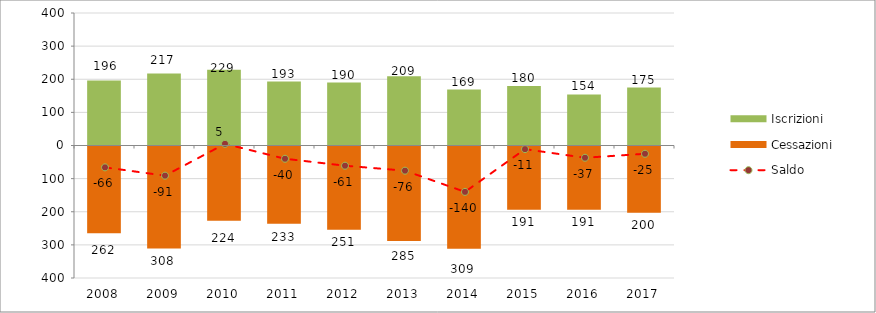
| Category | Iscrizioni | Cessazioni |
|---|---|---|
| 2008.0 | 196 | -262 |
| 2009.0 | 217 | -308 |
| 2010.0 | 229 | -224 |
| 2011.0 | 193 | -233 |
| 2012.0 | 190 | -251 |
| 2013.0 | 209 | -285 |
| 2014.0 | 169 | -309 |
| 2015.0 | 180 | -191 |
| 2016.0 | 154 | -191 |
| 2017.0 | 175 | -200 |